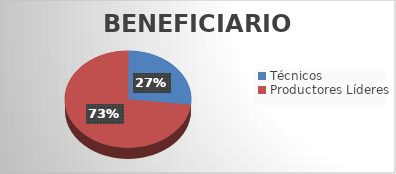
| Category | Series 0 |
|---|---|
| Técnicos | 91 |
| Productores Líderes | 248 |